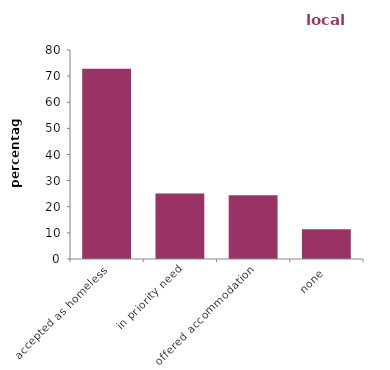
| Category | local authority |
|---|---|
| accepted as homeless | 72.844 |
| in priority need | 25.065 |
| offered accommodation | 24.366 |
| none | 11.427 |